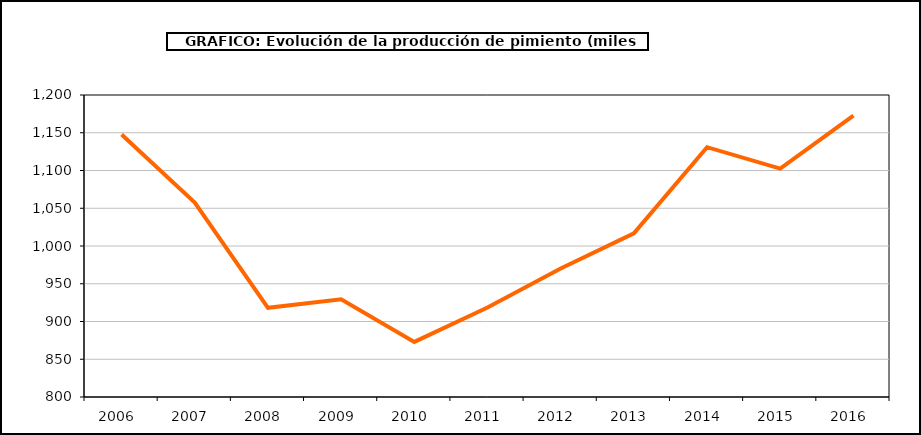
| Category | producción |
|---|---|
| 2006.0 | 1147.774 |
| 2007.0 | 1057.533 |
| 2008.0 | 918.14 |
| 2009.0 | 929.317 |
| 2010.0 | 873.011 |
| 2011.0 | 918.549 |
| 2012.0 | 970.296 |
| 2013.0 | 1016.811 |
| 2014.0 | 1130.863 |
| 2015.0 | 1102.522 |
| 2016.0 | 1172.639 |